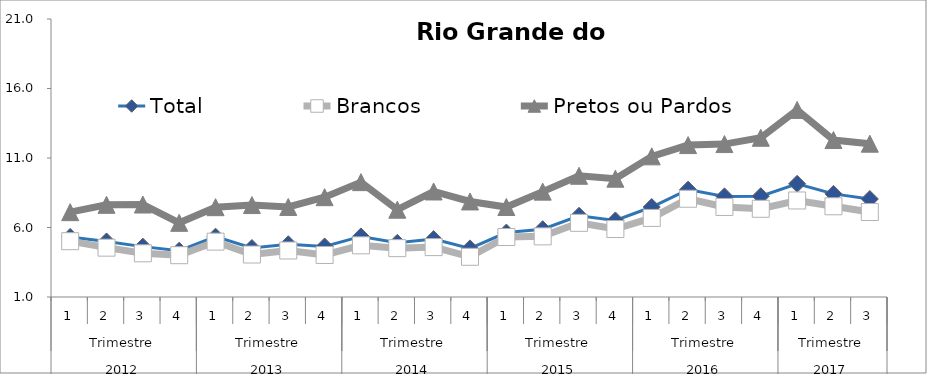
| Category | Total | Brancos | Pretos ou Pardos |
|---|---|---|---|
| 0 | 5.323 | 5.016 | 7.104 |
| 1 | 4.997 | 4.55 | 7.632 |
| 2 | 4.624 | 4.143 | 7.653 |
| 3 | 4.331 | 4.007 | 6.337 |
| 4 | 5.342 | 4.982 | 7.462 |
| 5 | 4.523 | 4.056 | 7.614 |
| 6 | 4.795 | 4.345 | 7.478 |
| 7 | 4.636 | 4.023 | 8.181 |
| 8 | 5.358 | 4.716 | 9.264 |
| 9 | 4.899 | 4.514 | 7.279 |
| 10 | 5.167 | 4.588 | 8.592 |
| 11 | 4.498 | 3.894 | 7.874 |
| 12 | 5.634 | 5.315 | 7.474 |
| 13 | 5.877 | 5.362 | 8.581 |
| 14 | 6.847 | 6.336 | 9.722 |
| 15 | 6.507 | 5.89 | 9.509 |
| 16 | 7.475 | 6.69 | 11.119 |
| 17 | 8.723 | 8.067 | 11.929 |
| 18 | 8.239 | 7.479 | 12.002 |
| 19 | 8.252 | 7.348 | 12.457 |
| 20 | 9.144 | 7.944 | 14.457 |
| 21 | 8.417 | 7.526 | 12.294 |
| 22 | 8.05 | 7.114 | 12.029 |